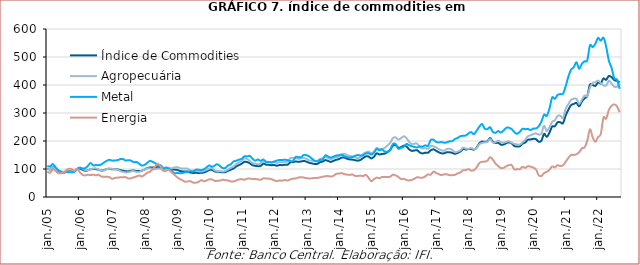
| Category | Índice de Commodities | Agropecuária | Metal | Energia |
|---|---|---|---|---|
| 2005-01-01 | 101.11 | 101.36 | 111.06 | 90.4 |
| 2005-02-01 | 98.34 | 98.74 | 109.01 | 86.39 |
| 2005-03-01 | 106.82 | 106.39 | 117.55 | 97.81 |
| 2005-04-01 | 99.86 | 99.59 | 106.79 | 93.86 |
| 2005-05-01 | 93.24 | 94.57 | 96.22 | 84.99 |
| 2005-06-01 | 90.22 | 91.39 | 90.57 | 85.08 |
| 2005-07-01 | 88.68 | 90.03 | 85.06 | 86.64 |
| 2005-08-01 | 90.46 | 89.02 | 90.36 | 95.79 |
| 2005-09-01 | 90.96 | 89.04 | 88.2 | 100.84 |
| 2005-10-01 | 93.09 | 92.41 | 88.79 | 99.71 |
| 2005-11-01 | 91.8 | 92.02 | 89.72 | 93.07 |
| 2005-12-01 | 100 | 100 | 100 | 100 |
| 2006-01-01 | 101.81 | 104.78 | 104.65 | 88.94 |
| 2006-02-01 | 97.57 | 101.56 | 102.09 | 79.31 |
| 2006-03-01 | 93.81 | 96.26 | 102.86 | 77.02 |
| 2006-04-01 | 95.29 | 95.82 | 111.04 | 79.54 |
| 2006-05-01 | 99.12 | 99.45 | 121.37 | 78.11 |
| 2006-06-01 | 99.63 | 101.78 | 112.93 | 79.96 |
| 2006-07-01 | 99.75 | 102.3 | 114.13 | 77.21 |
| 2006-08-01 | 97.05 | 97.67 | 113.68 | 79.31 |
| 2006-09-01 | 94.66 | 95.09 | 116.3 | 73.09 |
| 2006-10-01 | 95.76 | 95.15 | 123.34 | 72.32 |
| 2006-11-01 | 99.88 | 99.86 | 129.24 | 72.48 |
| 2006-12-01 | 100.81 | 100.71 | 132.91 | 70.92 |
| 2007-01-01 | 99.11 | 100.51 | 129.95 | 64.83 |
| 2007-02-01 | 98.79 | 98.85 | 130.53 | 68.13 |
| 2007-03-01 | 98.75 | 98.29 | 131.52 | 68.9 |
| 2007-04-01 | 95.87 | 92.61 | 135.28 | 70.45 |
| 2007-05-01 | 93.91 | 89.54 | 135.63 | 70.7 |
| 2007-06-01 | 92.03 | 87.96 | 130.28 | 70.8 |
| 2007-07-01 | 91.58 | 88.33 | 131.57 | 65.78 |
| 2007-08-01 | 93.84 | 91.72 | 129.92 | 67.12 |
| 2007-09-01 | 94.42 | 92.83 | 124.37 | 70.15 |
| 2007-10-01 | 92.96 | 89.37 | 125.16 | 73.17 |
| 2007-11-01 | 92.79 | 89.62 | 119.06 | 76.58 |
| 2007-12-01 | 93.82 | 93.98 | 112.21 | 73.37 |
| 2008-01-01 | 98 | 98.05 | 114.61 | 79 |
| 2008-02-01 | 103.45 | 102.18 | 121.93 | 86.49 |
| 2008-03-01 | 105.36 | 102.15 | 128.62 | 90.5 |
| 2008-04-01 | 105.34 | 100.4 | 125.72 | 98.47 |
| 2008-05-01 | 106.03 | 99.51 | 120.39 | 109.37 |
| 2008-06-01 | 107.75 | 101.57 | 112.06 | 118.47 |
| 2008-07-01 | 104.94 | 100.35 | 113.02 | 108.58 |
| 2008-08-01 | 97.28 | 95.88 | 102.75 | 93.53 |
| 2008-09-01 | 102.22 | 102.73 | 105.41 | 94.03 |
| 2008-10-01 | 102.97 | 104.17 | 100.62 | 96.42 |
| 2008-11-01 | 98.88 | 101.91 | 93.74 | 88.36 |
| 2008-12-01 | 97.98 | 105.39 | 85.55 | 79.93 |
| 2009-01-01 | 96.97 | 106.54 | 85.71 | 71.49 |
| 2009-02-01 | 93.49 | 103.6 | 84.97 | 64.43 |
| 2009-03-01 | 91.32 | 101.46 | 85.71 | 59.76 |
| 2009-04-01 | 90.71 | 101.47 | 88.25 | 54.71 |
| 2009-05-01 | 90.81 | 101.02 | 89.61 | 55.54 |
| 2009-06-01 | 87.34 | 94.71 | 91.94 | 56.56 |
| 2009-07-01 | 85.87 | 94.28 | 90.62 | 51.49 |
| 2009-08-01 | 86.52 | 93.61 | 97.36 | 51.12 |
| 2009-09-01 | 85.82 | 91.52 | 97.51 | 53.85 |
| 2009-10-01 | 86.38 | 90.83 | 96.39 | 60.02 |
| 2009-11-01 | 87.68 | 93.37 | 99.04 | 55.97 |
| 2009-12-01 | 91.77 | 96.99 | 105.85 | 59 |
| 2010-01-01 | 96.36 | 101.01 | 112.73 | 63.19 |
| 2010-02-01 | 96.7 | 102.85 | 107.98 | 62.53 |
| 2010-03-01 | 91.3 | 95.08 | 112.22 | 57.54 |
| 2010-04-01 | 90.12 | 92.12 | 117.25 | 57.75 |
| 2010-05-01 | 89.37 | 92.38 | 109.69 | 58.99 |
| 2010-06-01 | 87.96 | 90.98 | 103.21 | 61.46 |
| 2010-07-01 | 89.22 | 93.16 | 103.83 | 59.95 |
| 2010-08-01 | 93.76 | 98.32 | 112.92 | 58.72 |
| 2010-09-01 | 97.74 | 104.42 | 117.27 | 55.48 |
| 2010-10-01 | 102.18 | 108.89 | 126.86 | 55.29 |
| 2010-11-01 | 109.37 | 117.82 | 129.61 | 59.58 |
| 2010-12-01 | 114.05 | 123.07 | 133.34 | 62.66 |
| 2011-01-01 | 119.03 | 129.72 | 136.23 | 63.47 |
| 2011-02-01 | 125.67 | 138.16 | 145.49 | 61.84 |
| 2011-03-01 | 124.77 | 135.78 | 144.9 | 65.35 |
| 2011-04-01 | 120.59 | 128.88 | 146.73 | 65.63 |
| 2011-05-01 | 113.74 | 121.25 | 136.49 | 64.59 |
| 2011-06-01 | 111.36 | 119.31 | 129.76 | 64.23 |
| 2011-07-01 | 110.25 | 116.87 | 134.04 | 63.05 |
| 2011-08-01 | 111.02 | 119.72 | 129.28 | 61.55 |
| 2011-09-01 | 119.35 | 129.76 | 133.91 | 66.59 |
| 2011-10-01 | 115.74 | 126.6 | 124.93 | 65.94 |
| 2011-11-01 | 114.98 | 125.33 | 125.33 | 65.5 |
| 2011-12-01 | 113.62 | 124.27 | 122.88 | 63.91 |
| 2012-01-01 | 114.48 | 126.13 | 126.53 | 59.29 |
| 2012-02-01 | 111.7 | 121.72 | 129.97 | 57.15 |
| 2012-03-01 | 114.1 | 124.22 | 132.15 | 59.01 |
| 2012-04-01 | 113.8 | 123.92 | 132.1 | 58.41 |
| 2012-05-01 | 115.6 | 125.73 | 133.2 | 60.5 |
| 2012-06-01 | 115.24 | 126.11 | 131.59 | 58.61 |
| 2012-07-01 | 123.8 | 138.71 | 128.6 | 62.81 |
| 2012-08-01 | 124.72 | 139.31 | 128.8 | 65.35 |
| 2012-09-01 | 126.94 | 139.05 | 143.15 | 66.33 |
| 2012-10-01 | 125.61 | 136.54 | 141.79 | 69.38 |
| 2012-11-01 | 126.94 | 137.88 | 142.4 | 70.97 |
| 2012-12-01 | 128.75 | 139.3 | 150.16 | 69.17 |
| 2013-01-01 | 126.11 | 136.07 | 149.25 | 67.17 |
| 2013-02-01 | 122 | 131.05 | 144.98 | 66.37 |
| 2013-03-01 | 120.11 | 129.9 | 137.22 | 66.81 |
| 2013-04-01 | 118.01 | 128.12 | 129.79 | 68.08 |
| 2013-05-01 | 118.19 | 128.79 | 127.62 | 68.41 |
| 2013-06-01 | 124.03 | 136.06 | 132.37 | 69.91 |
| 2013-07-01 | 126.62 | 138.89 | 133.78 | 72.31 |
| 2013-08-01 | 131.71 | 142.51 | 148.77 | 74.18 |
| 2013-09-01 | 128.89 | 139 | 144.31 | 74.86 |
| 2013-10-01 | 125.28 | 134.81 | 140.85 | 73.11 |
| 2013-11-01 | 129.23 | 139.12 | 144.34 | 75.93 |
| 2013-12-01 | 132.85 | 141.76 | 147.96 | 82.52 |
| 2014-01-01 | 135.37 | 144.83 | 149.5 | 83.66 |
| 2014-02-01 | 140.49 | 151.74 | 150.76 | 85.28 |
| 2014-03-01 | 140.66 | 154.33 | 145.86 | 81.71 |
| 2014-04-01 | 136.79 | 149.81 | 142.47 | 79.89 |
| 2014-05-01 | 134.28 | 146.61 | 140.9 | 78.96 |
| 2014-06-01 | 133.55 | 144.63 | 142.82 | 80.23 |
| 2014-07-01 | 131.3 | 141.69 | 147.1 | 75.37 |
| 2014-08-01 | 129.87 | 138.89 | 149.81 | 75.34 |
| 2014-09-01 | 132.39 | 142.98 | 148.01 | 75.87 |
| 2014-10-01 | 139.28 | 153.56 | 149.14 | 74.99 |
| 2014-11-01 | 144.97 | 159.39 | 155.67 | 78.94 |
| 2014-12-01 | 144.54 | 162.05 | 155.88 | 68.41 |
| 2015-01-01 | 137.64 | 156.59 | 151.62 | 56.35 |
| 2015-02-01 | 143.96 | 162.47 | 157.86 | 63.56 |
| 2015-03-01 | 155.69 | 175.44 | 171.11 | 69.15 |
| 2015-04-01 | 151.96 | 171.26 | 166.85 | 67.29 |
| 2015-05-01 | 153.7 | 171.9 | 169.74 | 71.53 |
| 2015-06-01 | 155.07 | 175.76 | 162.38 | 71.53 |
| 2015-07-01 | 160.33 | 184.09 | 161.82 | 71.2 |
| 2015-08-01 | 168 | 193.41 | 169.74 | 72.45 |
| 2015-09-01 | 183.62 | 210.3 | 189 | 79.64 |
| 2015-10-01 | 185.03 | 213.08 | 189.09 | 77.24 |
| 2015-11-01 | 176.15 | 205.23 | 172.25 | 71.83 |
| 2015-12-01 | 178.15 | 209.86 | 175.48 | 64.25 |
| 2016-01-01 | 183.39 | 216.68 | 179.01 | 64.82 |
| 2016-02-01 | 180.54 | 210.97 | 189.38 | 60.98 |
| 2016-03-01 | 170.41 | 197.22 | 184.86 | 58.96 |
| 2016-04-01 | 164.72 | 188.81 | 181.15 | 61.1 |
| 2016-05-01 | 166.25 | 190.48 | 178.85 | 65.37 |
| 2016-06-01 | 166.98 | 190.51 | 176.96 | 70.83 |
| 2016-07-01 | 158.77 | 177.69 | 180.87 | 69.11 |
| 2016-08-01 | 155.61 | 173.26 | 179.93 | 68.67 |
| 2016-09-01 | 158.33 | 174.84 | 184.53 | 73.58 |
| 2016-10-01 | 158.07 | 172.03 | 182.41 | 80.67 |
| 2016-11-01 | 166.76 | 181.96 | 203.21 | 79.63 |
| 2016-12-01 | 170.31 | 181.07 | 204.77 | 90.46 |
| 2017-01-01 | 165.23 | 177.15 | 197.06 | 85.96 |
| 2017-02-01 | 159.6 | 170.8 | 194.84 | 81.6 |
| 2017-03-01 | 156.07 | 166.61 | 196.18 | 78.11 |
| 2017-04-01 | 156.15 | 165.4 | 193.74 | 81.35 |
| 2017-05-01 | 160.04 | 171.68 | 195.29 | 80.8 |
| 2017-06-01 | 159.74 | 171.84 | 198.8 | 78.17 |
| 2017-07-01 | 157.57 | 168.11 | 199.63 | 77.91 |
| 2017-08-01 | 154.23 | 160.08 | 207.01 | 79.41 |
| 2017-09-01 | 157.54 | 161.96 | 211.02 | 84.12 |
| 2017-10-01 | 162.52 | 166.48 | 217.08 | 88.01 |
| 2017-11-01 | 171.15 | 176.05 | 218.67 | 95.52 |
| 2017-12-01 | 169.65 | 173.02 | 219.7 | 96.01 |
| 2018-01-01 | 171.2 | 171.89 | 226.95 | 99.46 |
| 2018-02-01 | 171.78 | 174.84 | 231.79 | 94.14 |
| 2018-03-01 | 169.09 | 171.09 | 224.14 | 96.08 |
| 2018-04-01 | 175.83 | 174.02 | 236.5 | 105.4 |
| 2018-05-01 | 191.92 | 188.25 | 250.89 | 121.01 |
| 2018-06-01 | 197.93 | 192.98 | 260.76 | 125.79 |
| 2018-07-01 | 197.04 | 195.08 | 244.25 | 126.38 |
| 2018-08-01 | 198.68 | 196.26 | 242.48 | 129.56 |
| 2018-09-01 | 210.59 | 206.97 | 249.44 | 142.21 |
| 2018-10-01 | 197.73 | 194.34 | 232.99 | 133.95 |
| 2018-11-01 | 192.92 | 195.76 | 229.03 | 119.66 |
| 2018-12-01 | 193.73 | 201.44 | 235.59 | 110.42 |
| 2019-01-01 | 186.91 | 195.69 | 230.31 | 103.37 |
| 2019-02-01 | 187.38 | 194.25 | 237.39 | 104.24 |
| 2019-03-01 | 192.19 | 196.56 | 247.03 | 110.08 |
| 2019-04-01 | 195.13 | 198.98 | 247.49 | 114 |
| 2019-05-01 | 191.27 | 193.74 | 242.52 | 113.97 |
| 2019-06-01 | 181.86 | 189.84 | 231.93 | 98.31 |
| 2019-07-01 | 180.49 | 187.91 | 225.68 | 99.68 |
| 2019-08-01 | 180.99 | 187.31 | 232.67 | 98.98 |
| 2019-09-01 | 190.45 | 194.95 | 243.61 | 107.86 |
| 2019-10-01 | 194.65 | 204.22 | 242.26 | 104.1 |
| 2019-11-01 | 204.27 | 216.67 | 242.82 | 109.9 |
| 2019-12-01 | 205.54 | 220.39 | 239.4 | 108.41 |
| 2020-01-01 | 207.56 | 224.73 | 244.1 | 104.95 |
| 2020-02-01 | 206.62 | 226.97 | 244.69 | 98.43 |
| 2020-03-01 | 197.72 | 222.98 | 252.59 | 78.1 |
| 2020-04-01 | 200.81 | 226.36 | 268.85 | 74.99 |
| 2020-05-01 | 225.52 | 254.25 | 294 | 85.56 |
| 2020-06-01 | 214.57 | 234.64 | 289.79 | 89.74 |
| 2020-07-01 | 229.77 | 249.4 | 315.48 | 97.08 |
| 2020-08-01 | 251.34 | 268.54 | 355.27 | 109.12 |
| 2020-09-01 | 252.69 | 273.79 | 350.69 | 106.04 |
| 2020-10-01 | 266.69 | 289.01 | 364.31 | 113.71 |
| 2020-11-01 | 267 | 290.4 | 367.6 | 110.59 |
| 2020-12-01 | 263.38 | 282.23 | 368.73 | 113.29 |
| 2021-01-01 | 291.18 | 314.23 | 395.29 | 126.03 |
| 2021-02-01 | 311.65 | 331.74 | 429.96 | 139.53 |
| 2021-03-01 | 328.22 | 346.53 | 454.64 | 150.32 |
| 2021-04-01 | 332.2 | 350.9 | 463.45 | 149.86 |
| 2021-05-01 | 335.87 | 350.52 | 481.68 | 153.11 |
| 2021-06-01 | 323.94 | 332.49 | 457.52 | 159.75 |
| 2021-07-01 | 340.69 | 347.42 | 475.38 | 174.06 |
| 2021-08-01 | 352.27 | 362.39 | 484.7 | 177.39 |
| 2021-09-01 | 360.47 | 360.43 | 488.15 | 201.36 |
| 2021-10-01 | 401.15 | 390.44 | 541.31 | 241.6 |
| 2021-11-01 | 399.81 | 407.22 | 535.25 | 213.48 |
| 2021-12-01 | 396.96 | 409.88 | 547.55 | 197 |
| 2022-01-01 | 408.84 | 415.9 | 568.62 | 214.19 |
| 2022-02-01 | 405.63 | 406.76 | 557.85 | 224.69 |
| 2022-03-01 | 423.39 | 398.94 | 568.76 | 283.14 |
| 2022-04-01 | 418.63 | 398 | 537.02 | 279.79 |
| 2022-05-01 | 432.11 | 414.86 | 486.93 | 310.53 |
| 2022-06-01 | 428.02 | 405.45 | 461.63 | 325.59 |
| 2022-07-01 | 417.62 | 393.98 | 423.98 | 330.55 |
| 2022-08-01 | 414.63 | 393.51 | 419.15 | 324.07 |
| 2022-09-01 | 408.91 | 404.05 | 386.43 | 303.29 |